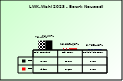
| Category | 2018 | 2023 |
|---|---|---|
| Bgld. Bauernbund | 0.784 | 0.799 |
| SPÖ Bauern | 0.158 | 0.147 |
| Freiheitliche Bauern | 0.057 | 0.055 |